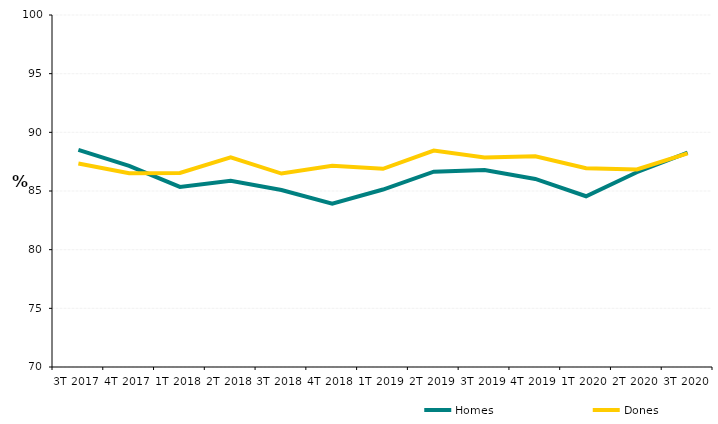
| Category | Homes | Dones |
|---|---|---|
| 3T 2017 | 88.507 | 87.339 |
| 4T 2017 | 87.142 | 86.507 |
| 1T 2018 | 85.345 | 86.54 |
| 2T 2018 | 85.874 | 87.877 |
| 3T 2018 | 85.086 | 86.487 |
| 4T 2018 | 83.923 | 87.155 |
| 1T 2019 | 85.126 | 86.89 |
| 2T 2019 | 86.642 | 88.448 |
| 3T 2019 | 86.783 | 87.859 |
| 4T 2019 | 86.03 | 87.959 |
| 1T 2020 | 84.553 | 86.943 |
| 2T 2020 | 86.6 | 86.837 |
| 3T 2020 | 88.262 | 88.208 |